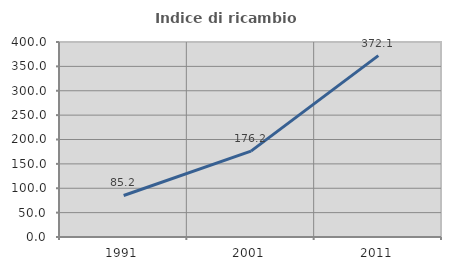
| Category | Indice di ricambio occupazionale  |
|---|---|
| 1991.0 | 85.156 |
| 2001.0 | 176.19 |
| 2011.0 | 372.131 |